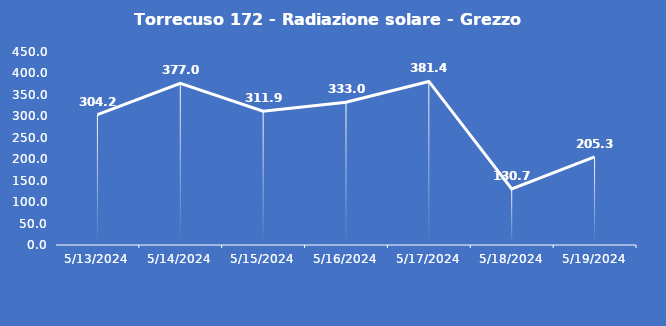
| Category | Torrecuso 172 - Radiazione solare - Grezzo (W/m2) |
|---|---|
| 5/13/24 | 304.2 |
| 5/14/24 | 377 |
| 5/15/24 | 311.9 |
| 5/16/24 | 333 |
| 5/17/24 | 381.4 |
| 5/18/24 | 130.7 |
| 5/19/24 | 205.3 |